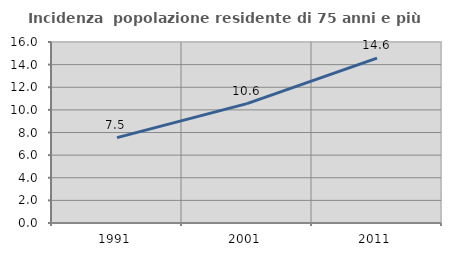
| Category | Incidenza  popolazione residente di 75 anni e più |
|---|---|
| 1991.0 | 7.544 |
| 2001.0 | 10.553 |
| 2011.0 | 14.568 |